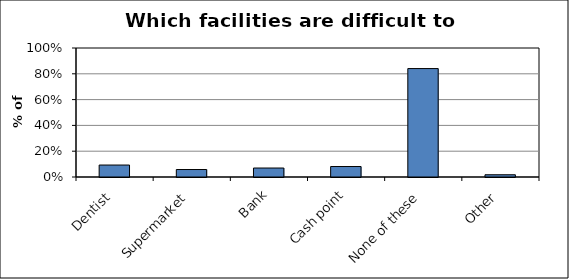
| Category | Series 0 |
|---|---|
| Dentist | 0.093 |
| Supermarket | 0.058 |
| Bank | 0.07 |
| Cash point | 0.081 |
| None of these | 0.841 |
| Other | 0.017 |